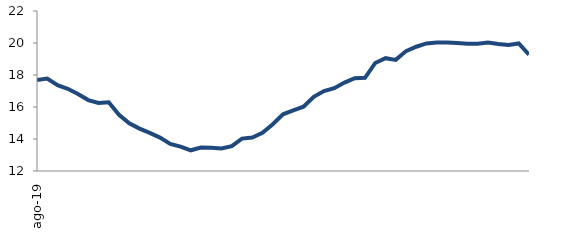
| Category | Series 0 |
|---|---|
| 2019-08-01 | 17.694 |
| 2019-09-01 | 17.777 |
| 2019-10-01 | 17.36 |
| 2019-11-01 | 17.14 |
| 2019-12-01 | 16.808 |
| 2020-01-01 | 16.434 |
| 2020-02-01 | 16.25 |
| 2020-03-01 | 16.293 |
| 2020-04-01 | 15.517 |
| 2020-05-01 | 14.987 |
| 2020-06-01 | 14.648 |
| 2020-07-01 | 14.379 |
| 2020-08-01 | 14.088 |
| 2020-09-01 | 13.698 |
| 2020-10-01 | 13.522 |
| 2020-11-01 | 13.294 |
| 2020-12-01 | 13.469 |
| 2021-01-01 | 13.453 |
| 2021-02-01 | 13.409 |
| 2021-03-01 | 13.556 |
| 2021-04-01 | 14.027 |
| 2021-05-01 | 14.092 |
| 2021-06-01 | 14.388 |
| 2021-07-01 | 14.927 |
| 2021-08-01 | 15.546 |
| 2021-09-01 | 15.791 |
| 2021-10-01 | 16.017 |
| 2021-11-01 | 16.641 |
| 2021-12-01 | 16.998 |
| 2022-01-01 | 17.179 |
| 2022-02-01 | 17.527 |
| 2022-03-01 | 17.804 |
| 2022-04-01 | 17.825 |
| 2022-05-01 | 18.751 |
| 2022-06-01 | 19.052 |
| 2022-07-01 | 18.945 |
| 2022-08-01 | 19.494 |
| 2022-09-01 | 19.767 |
| 2022-10-01 | 19.975 |
| 2022-11-01 | 20.037 |
| 2022-12-01 | 20.03 |
| 2023-01-01 | 19.993 |
| 2023-02-01 | 19.949 |
| 2023-03-01 | 19.953 |
| 2023-04-01 | 20.023 |
| 2023-05-01 | 19.94 |
| 2023-06-01 | 19.871 |
| 2023-07-01 | 19.969 |
| 2023-08-01 | 19.275 |